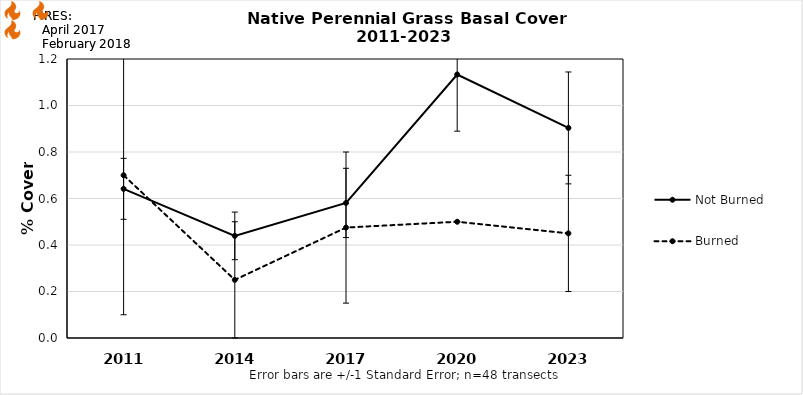
| Category | Not Burned | Burned |
|---|---|---|
| 2011.0 | 0.642 | 0.7 |
| 2014.0 | 0.439 | 0.25 |
| 2017.0 | 0.581 | 0.475 |
| 2020.0 | 1.133 | 0.5 |
| 2023.0 | 0.904 | 0.45 |